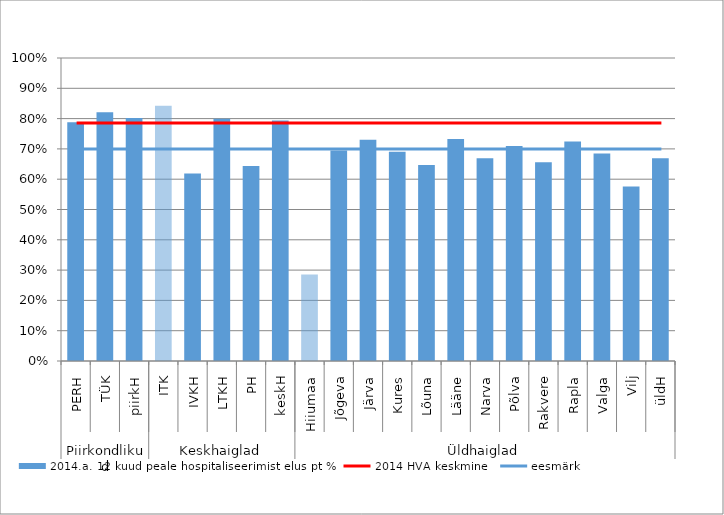
| Category | 2014.a. 12 kuud peale hospitaliseerimist elus pt % |
|---|---|
| 0 | 0.788 |
| 1 | 0.821 |
| 2 | 0.802 |
| 3 | 0.842 |
| 4 | 0.619 |
| 5 | 0.8 |
| 6 | 0.644 |
| 7 | 0.794 |
| 8 | 0.286 |
| 9 | 0.695 |
| 10 | 0.73 |
| 11 | 0.691 |
| 12 | 0.647 |
| 13 | 0.733 |
| 14 | 0.669 |
| 15 | 0.71 |
| 16 | 0.656 |
| 17 | 0.724 |
| 18 | 0.685 |
| 19 | 0.576 |
| 20 | 0.669 |